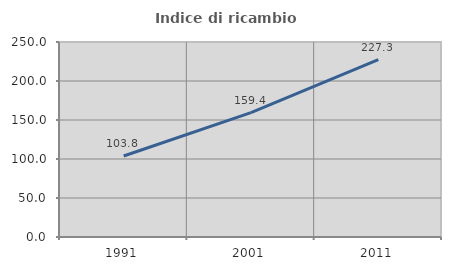
| Category | Indice di ricambio occupazionale  |
|---|---|
| 1991.0 | 103.81 |
| 2001.0 | 159.375 |
| 2011.0 | 227.273 |